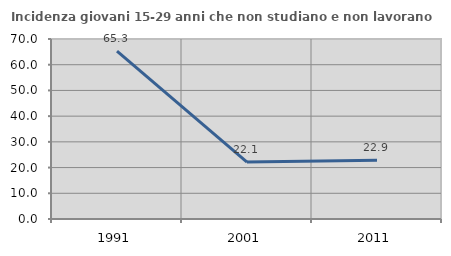
| Category | Incidenza giovani 15-29 anni che non studiano e non lavorano  |
|---|---|
| 1991.0 | 65.316 |
| 2001.0 | 22.148 |
| 2011.0 | 22.857 |